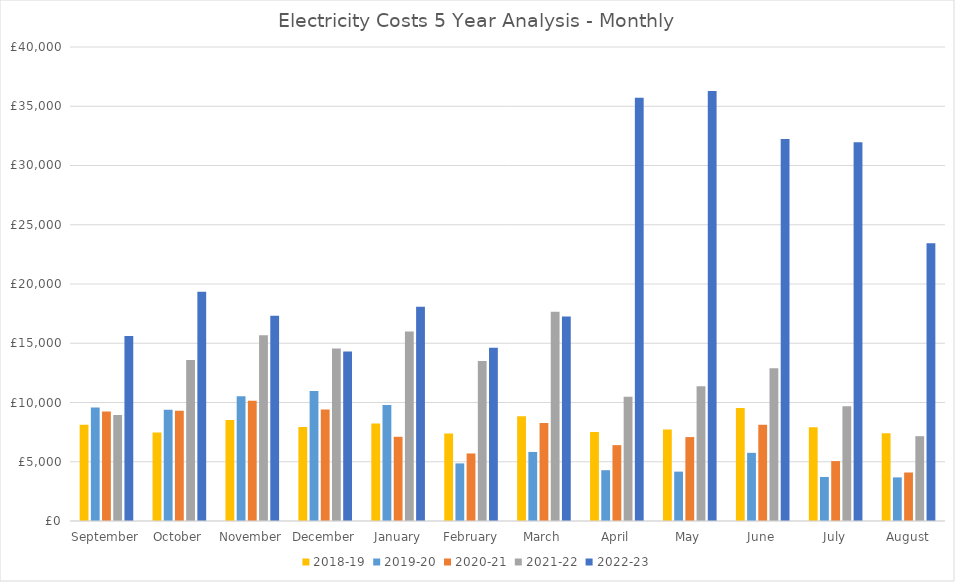
| Category | 2018-19 | 2019-20 | 2020-21 | 2021-22 | 2022-23 |
|---|---|---|---|---|---|
| September  | 8116.09 | 9574.05 | 9244 | 8939 | 15607 |
| October | 7467.75 | 9380 | 9314 | 13590 | 19341 |
| November | 8513.12 | 10523.74 | 10158 | 15671 | 17314 |
| December | 7938.87 | 10972 | 9403 | 14565 | 14310 |
| January | 8228.64 | 9799 | 7106 | 15991 | 18090 |
| February | 7390.54 | 4861 | 5699 | 13498 | 14610 |
| March | 8843.11 | 5827 | 8260 | 17653 | 17248 |
| April | 7501.71 | 4288 | 6402 | 10486 | 35722 |
| May | 7729.5 | 4167 | 7083 | 11366 | 36296 |
| June | 9542.75 | 5753 | 8117 | 12893 | 32240 |
| July | 7904 | 3716 | 5056 | 9694 | 31967 |
| August | 7398.09 | 3681 | 4092 | 7158 | 23429 |